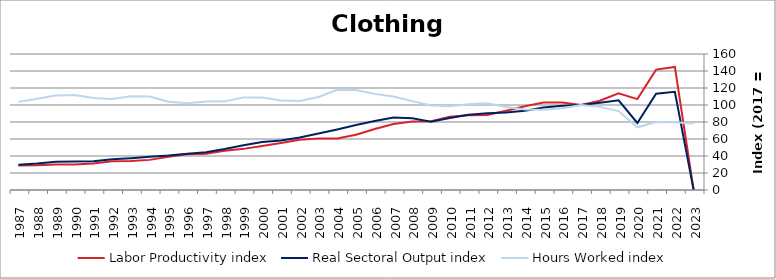
| Category | Labor Productivity index | Real Sectoral Output index | Hours Worked index |
|---|---|---|---|
| 2023.0 | 0 | 0 | 78.15 |
| 2022.0 | 144.772 | 115.585 | 79.839 |
| 2021.0 | 141.64 | 113.293 | 79.986 |
| 2020.0 | 106.929 | 78.856 | 73.746 |
| 2019.0 | 113.718 | 105.549 | 92.817 |
| 2018.0 | 105.007 | 102.695 | 97.799 |
| 2017.0 | 100 | 100 | 100 |
| 2016.0 | 102.885 | 99.016 | 96.239 |
| 2015.0 | 102.878 | 97.163 | 94.445 |
| 2014.0 | 98.598 | 93.337 | 94.664 |
| 2013.0 | 93.307 | 91.09 | 97.624 |
| 2012.0 | 88.279 | 90.182 | 102.156 |
| 2011.0 | 87.929 | 88.629 | 100.796 |
| 2010.0 | 86.085 | 84.81 | 98.519 |
| 2009.0 | 80.837 | 80.399 | 99.459 |
| 2008.0 | 80.633 | 84.301 | 104.549 |
| 2007.0 | 77.688 | 85.411 | 109.942 |
| 2006.0 | 71.854 | 81.257 | 113.086 |
| 2005.0 | 65.034 | 76.459 | 117.569 |
| 2004.0 | 60.472 | 71.256 | 117.832 |
| 2003.0 | 60.717 | 66.492 | 109.51 |
| 2002.0 | 59.006 | 61.787 | 104.712 |
| 2001.0 | 55.257 | 58.175 | 105.281 |
| 2000.0 | 51.78 | 56.408 | 108.937 |
| 1999.0 | 48.389 | 52.676 | 108.86 |
| 1998.0 | 46.212 | 48.193 | 104.285 |
| 1997.0 | 42.616 | 44.413 | 104.217 |
| 1996.0 | 41.948 | 42.788 | 102.002 |
| 1995.0 | 39.112 | 40.575 | 103.741 |
| 1994.0 | 35.441 | 39.017 | 110.092 |
| 1993.0 | 34.022 | 37.478 | 110.158 |
| 1992.0 | 33.777 | 36.146 | 107.011 |
| 1991.0 | 31.197 | 33.784 | 108.296 |
| 1990.0 | 29.907 | 33.399 | 111.675 |
| 1989.0 | 29.959 | 33.302 | 111.159 |
| 1988.0 | 29.12 | 31.27 | 107.38 |
| 1987.0 | 28.727 | 29.787 | 103.69 |